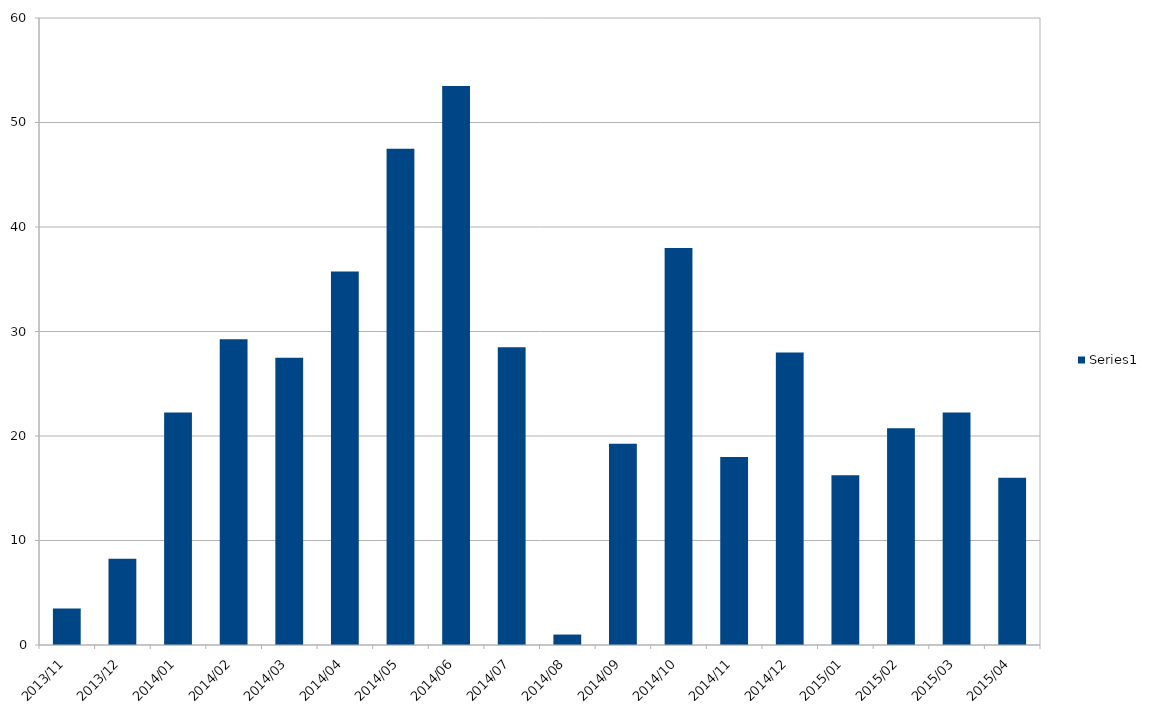
| Category | Series 0 |
|---|---|
| 2013/11 | 3.5 |
| 2013/12 | 8.25 |
| 2014/01 | 22.25 |
| 2014/02 | 29.25 |
| 2014/03 | 27.5 |
| 2014/04 | 35.75 |
| 2014/05 | 47.5 |
| 2014/06 | 53.5 |
| 2014/07 | 28.5 |
| 2014/08 | 1 |
| 2014/09 | 19.25 |
| 2014/10 | 38 |
| 2014/11 | 18 |
| 2014/12 | 28 |
| 2015/01 | 16.25 |
| 2015/02 | 20.75 |
| 2015/03 | 22.25 |
| 2015/04 | 16 |